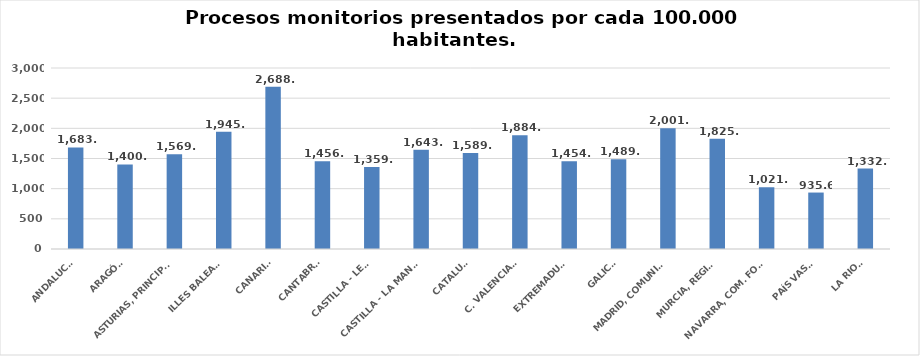
| Category | Series 0 |
|---|---|
| ANDALUCÍA | 1683.903 |
| ARAGÓN | 1400.705 |
| ASTURIAS, PRINCIPADO | 1569.69 |
| ILLES BALEARS | 1945.426 |
| CANARIAS | 2688.196 |
| CANTABRIA | 1456.27 |
| CASTILLA - LEÓN | 1359.929 |
| CASTILLA - LA MANCHA | 1643.571 |
| CATALUÑA | 1589.814 |
| C. VALENCIANA | 1884.033 |
| EXTREMADURA | 1454.27 |
| GALICIA | 1489.143 |
| MADRID, COMUNIDAD | 2001.659 |
| MURCIA, REGIÓN | 1825.437 |
| NAVARRA, COM. FORAL | 1021.863 |
| PAÍS VASCO | 935.595 |
| LA RIOJA | 1332.412 |